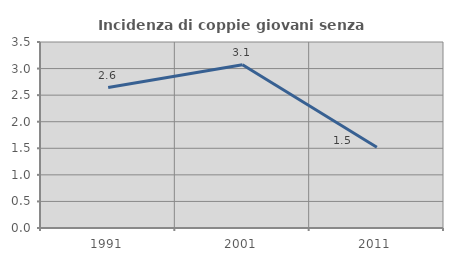
| Category | Incidenza di coppie giovani senza figli |
|---|---|
| 1991.0 | 2.642 |
| 2001.0 | 3.07 |
| 2011.0 | 1.519 |